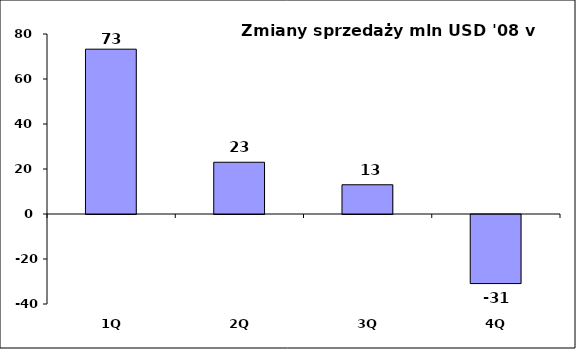
| Category | '08 v '07 |
|---|---|
| 1Q | 73.251 |
| 2Q | 23 |
| 3Q | 13 |
| 4Q | -30.7 |